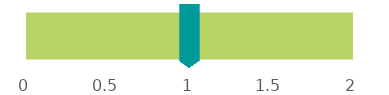
| Category | Top Conditions Opioids are Most Prescribed For | Condition |      Low Back Pain |
|---|---|---|---|
| 0 |  | 0 | 2 |